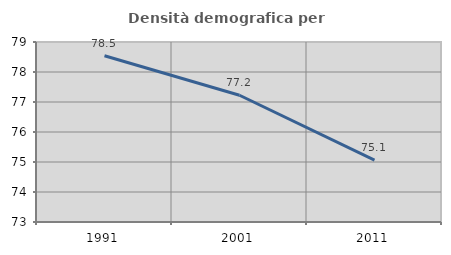
| Category | Densità demografica |
|---|---|
| 1991.0 | 78.542 |
| 2001.0 | 77.225 |
| 2011.0 | 75.061 |